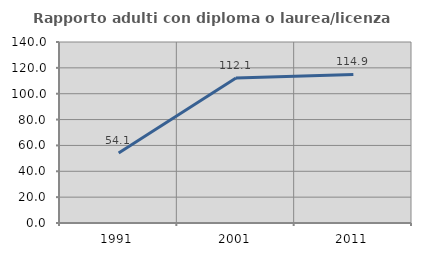
| Category | Rapporto adulti con diploma o laurea/licenza media  |
|---|---|
| 1991.0 | 54.108 |
| 2001.0 | 112.097 |
| 2011.0 | 114.882 |